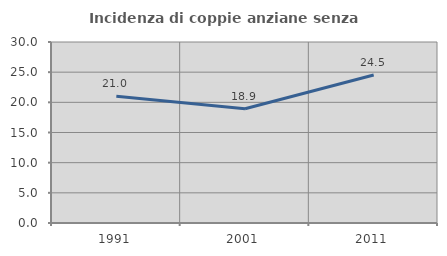
| Category | Incidenza di coppie anziane senza figli  |
|---|---|
| 1991.0 | 21.023 |
| 2001.0 | 18.935 |
| 2011.0 | 24.528 |